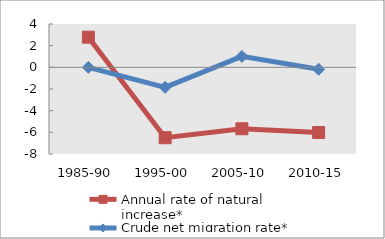
| Category | Annual rate of natural increase* | Crude net migration rate* |
|---|---|---|
| 1985-90 | 2.785 | 0 |
| 1995-00 | -6.497 | -1.845 |
| 2005-10 | -5.67 | 1.01 |
| 2010-15 | -6.016 | -0.176 |